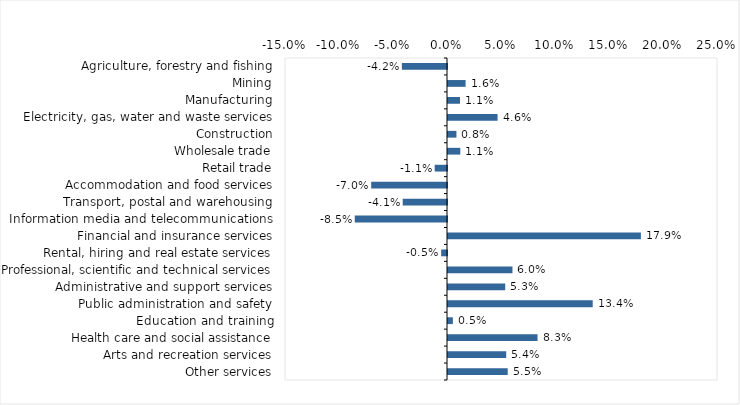
| Category | This week |
|---|---|
| Agriculture, forestry and fishing | -0.042 |
| Mining | 0.016 |
| Manufacturing | 0.011 |
| Electricity, gas, water and waste services | 0.046 |
| Construction | 0.008 |
| Wholesale trade | 0.011 |
| Retail trade | -0.011 |
| Accommodation and food services | -0.07 |
| Transport, postal and warehousing | -0.041 |
| Information media and telecommunications | -0.085 |
| Financial and insurance services | 0.179 |
| Rental, hiring and real estate services | -0.005 |
| Professional, scientific and technical services | 0.06 |
| Administrative and support services | 0.053 |
| Public administration and safety | 0.134 |
| Education and training | 0.004 |
| Health care and social assistance | 0.083 |
| Arts and recreation services | 0.054 |
| Other services | 0.055 |